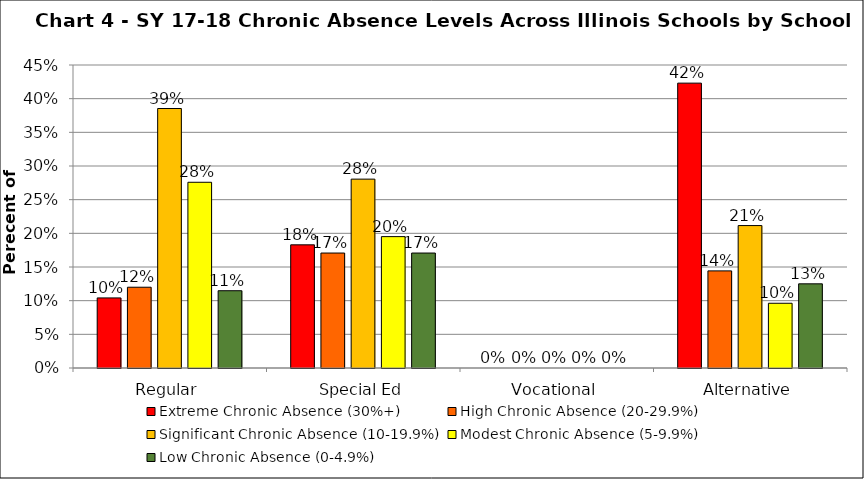
| Category | Extreme Chronic Absence (30%+) | High Chronic Absence (20-29.9%) | Significant Chronic Absence (10-19.9%) | Modest Chronic Absence (5-9.9%) | Low Chronic Absence (0-4.9%) |
|---|---|---|---|---|---|
| 0 | 0.104 | 0.12 | 0.385 | 0.276 | 0.115 |
| 1 | 0.183 | 0.171 | 0.28 | 0.195 | 0.171 |
| 2 | 0 | 0 | 0 | 0 | 0 |
| 3 | 0.423 | 0.144 | 0.212 | 0.096 | 0.125 |